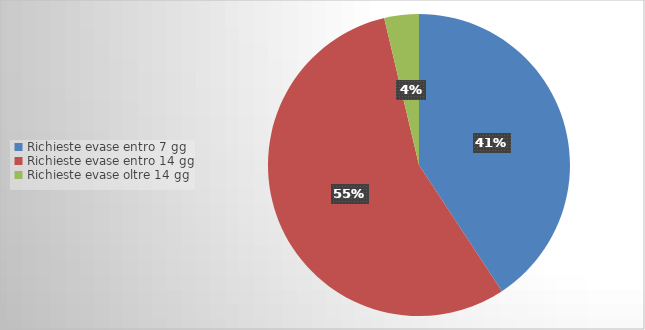
| Category | Series 0 |
|---|---|
| Richieste evase entro 7 gg | 11 |
| Richieste evase entro 14 gg | 15 |
| Richieste evase oltre 14 gg | 1 |